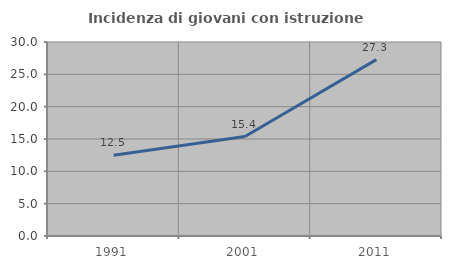
| Category | Incidenza di giovani con istruzione universitaria |
|---|---|
| 1991.0 | 12.5 |
| 2001.0 | 15.385 |
| 2011.0 | 27.273 |